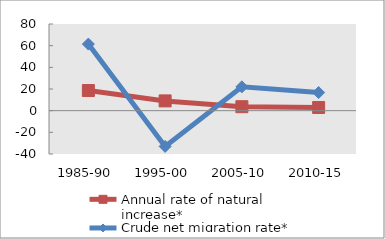
| Category | Annual rate of natural increase* | Crude net migration rate* |
|---|---|---|
| 1985-90 | 18.599 | 61.438 |
| 1995-00 | 9.016 | -32.966 |
| 2005-10 | 3.649 | 21.999 |
| 2010-15 | 2.934 | 16.723 |